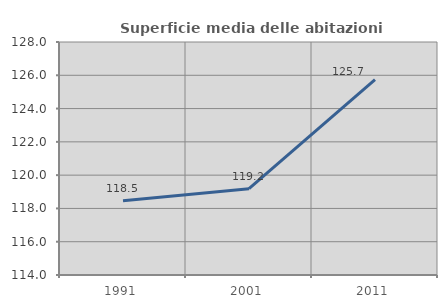
| Category | Superficie media delle abitazioni occupate |
|---|---|
| 1991.0 | 118.456 |
| 2001.0 | 119.188 |
| 2011.0 | 125.738 |